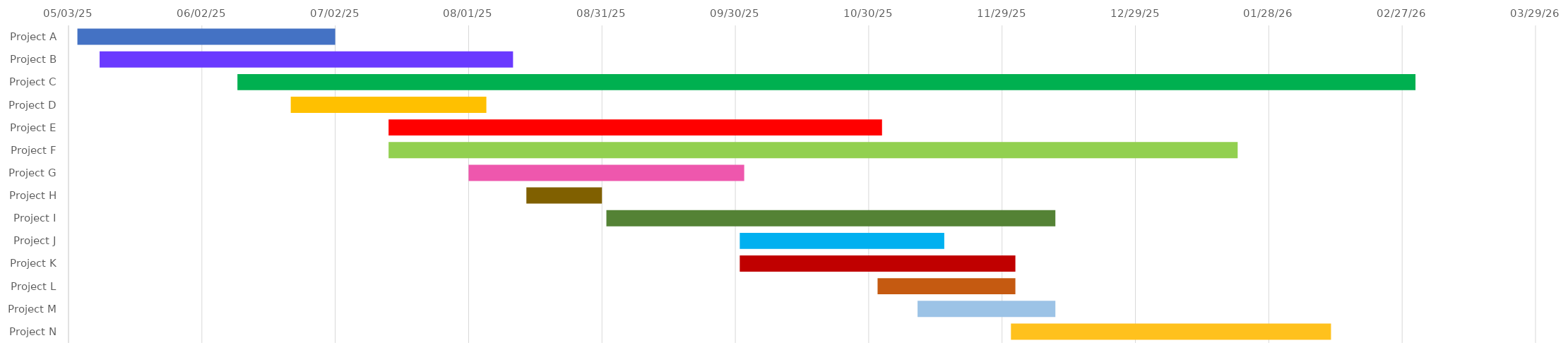
| Category | START 
DATE | Duration |
|---|---|---|
| Project A | 2025-05-05 | 58 |
| Project B | 2025-05-10 | 93 |
| Project C | 2025-06-10 | 265 |
| Project D | 2025-06-22 | 44 |
| Project E | 2025-07-14 | 111 |
| Project F | 2025-07-14 | 191 |
| Project G | 2025-08-01 | 62 |
| Project H | 2025-08-14 | 17 |
| Project I | 2025-09-01 | 101 |
| Project J | 2025-10-01 | 46 |
| Project K | 2025-10-01 | 62 |
| Project L | 2025-11-01 | 31 |
| Project M | 2025-11-10 | 31 |
| Project N | 2025-12-01 | 72 |